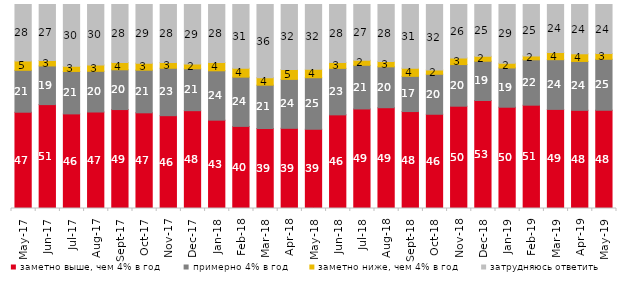
| Category | заметно выше, чем 4% в год | примерно 4% в год | заметно ниже, чем 4% в год | затрудняюсь ответить |
|---|---|---|---|---|
| 2017-05-01 | 47.2 | 20.55 | 4.55 | 27.7 |
| 2017-06-01 | 50.9 | 18.95 | 2.65 | 27.45 |
| 2017-07-01 | 46.35 | 20.8 | 2.5 | 30.3 |
| 2017-08-01 | 47.3 | 19.95 | 3.1 | 29.65 |
| 2017-09-01 | 48.5 | 19.5 | 3.55 | 28.45 |
| 2017-10-01 | 46.9 | 20.9 | 3.45 | 28.75 |
| 2017-11-01 | 45.5 | 23.25 | 2.85 | 28.4 |
| 2017-12-01 | 47.95 | 20.55 | 2.3 | 29.2 |
| 2018-01-01 | 43.3 | 24.2 | 4.05 | 28.45 |
| 2018-02-01 | 40.25 | 24.15 | 4.35 | 31.25 |
| 2018-03-01 | 39.2 | 21.25 | 3.7 | 35.85 |
| 2018-04-01 | 39.3 | 24 | 4.85 | 31.85 |
| 2018-05-01 | 38.8 | 25.3 | 4.15 | 31.75 |
| 2018-06-01 | 45.9 | 22.8 | 2.85 | 28.45 |
| 2018-07-01 | 48.8 | 21.4 | 2.45 | 27.35 |
| 2018-08-01 | 49.4 | 20.05 | 2.55 | 28 |
| 2018-09-01 | 47.5 | 17.25 | 4 | 31.2 |
| 2018-10-01 | 46.2 | 19.6 | 2.15 | 32.05 |
| 2018-11-01 | 50.15 | 20.409 | 3.244 | 26.198 |
| 2018-12-01 | 52.95 | 19.25 | 2.4 | 25.4 |
| 2019-01-01 | 49.65 | 19.25 | 2.3 | 28.8 |
| 2019-02-01 | 50.65 | 22.25 | 1.9 | 25.2 |
| 2019-03-01 | 48.583 | 24.366 | 3.531 | 23.521 |
| 2019-04-01 | 48.119 | 23.96 | 3.762 | 24.158 |
| 2019-05-01 | 48.143 | 25.012 | 2.823 | 24.022 |